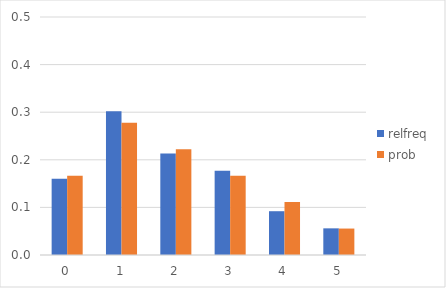
| Category | relfreq | prob |
|---|---|---|
| 0.0 | 0.16 | 0.167 |
| 1.0 | 0.302 | 0.278 |
| 2.0 | 0.213 | 0.222 |
| 3.0 | 0.177 | 0.167 |
| 4.0 | 0.092 | 0.111 |
| 5.0 | 0.056 | 0.056 |